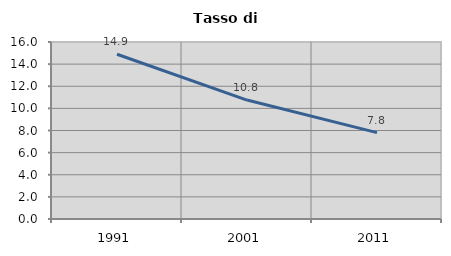
| Category | Tasso di disoccupazione   |
|---|---|
| 1991.0 | 14.89 |
| 2001.0 | 10.751 |
| 2011.0 | 7.807 |